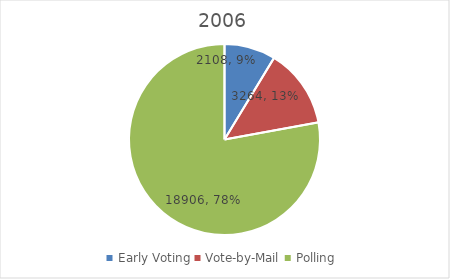
| Category | Series 0 |
|---|---|
| Early Voting | 2108 |
| Vote-by-Mail | 3264 |
| Polling | 18906 |